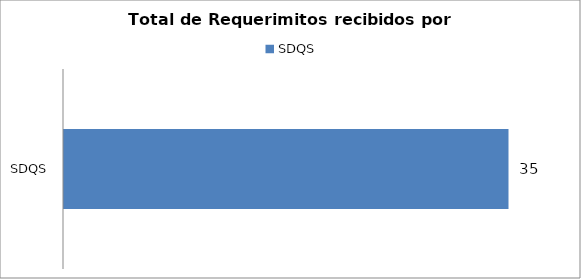
| Category | Total |
|---|---|
| SDQS | 35 |